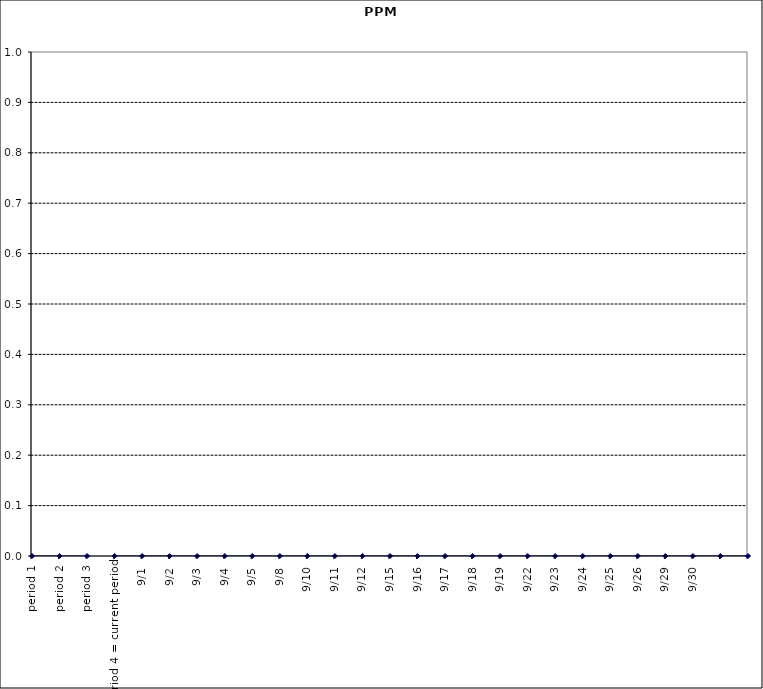
| Category | Series 0 |
|---|---|
| period 1 | 0 |
| period 2 | 0 |
| period 3 | 0 |
| period 4 = current period | 0 |
| 9/1 | 0 |
| 9/2 | 0 |
| 9/3 | 0 |
| 9/4 | 0 |
| 9/5 | 0 |
| 9/8 | 0 |
| 9/10 | 0 |
| 9/11 | 0 |
| 9/12 | 0 |
| 9/15 | 0 |
| 9/16 | 0 |
| 9/17 | 0 |
| 9/18 | 0 |
| 9/19 | 0 |
| 9/22 | 0 |
| 9/23 | 0 |
| 9/24 | 0 |
| 9/25 | 0 |
| 9/26 | 0 |
| 9/29 | 0 |
| 9/30 | 0 |